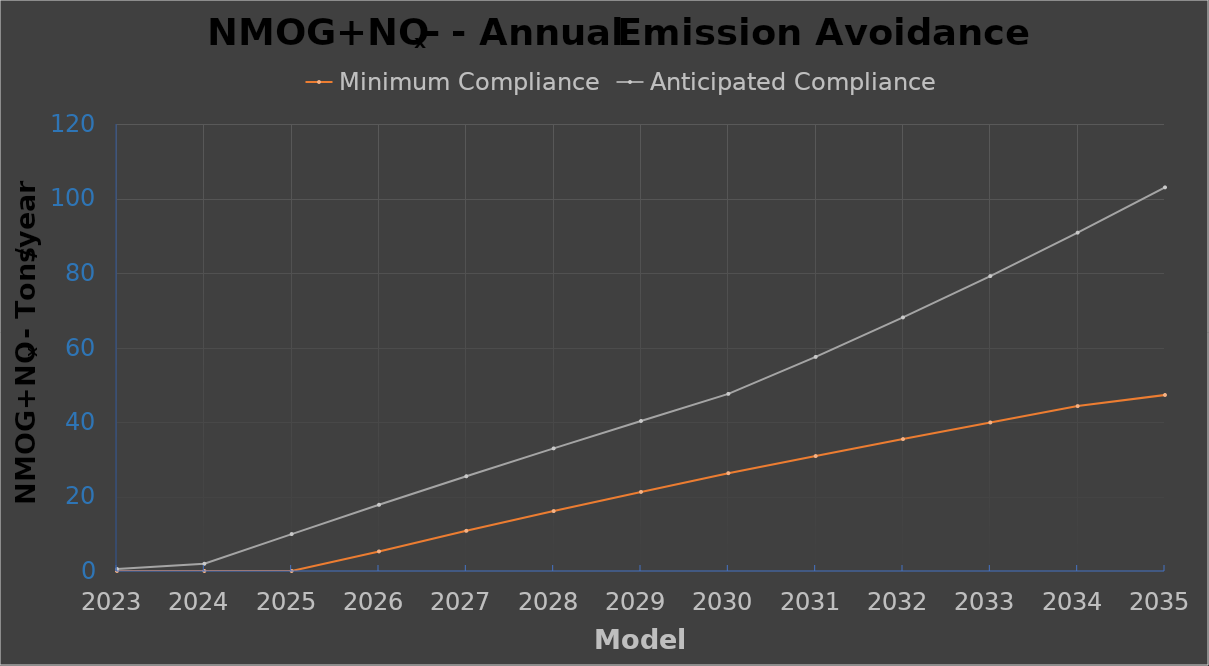
| Category | Minimum Compliance | Anticipated Compliance |
|---|---|---|
| 2023.0 | 0 | 0.529 |
| 2024.0 | 0 | 1.939 |
| 2025.0 | 0 | 9.912 |
| 2026.0 | 5.258 | 17.773 |
| 2027.0 | 10.786 | 25.436 |
| 2028.0 | 16.086 | 32.915 |
| 2029.0 | 21.227 | 40.27 |
| 2030.0 | 26.263 | 47.551 |
| 2031.0 | 30.859 | 57.472 |
| 2032.0 | 35.413 | 68.073 |
| 2033.0 | 39.872 | 79.171 |
| 2034.0 | 44.269 | 90.83 |
| 2035.0 | 47.249 | 102.981 |